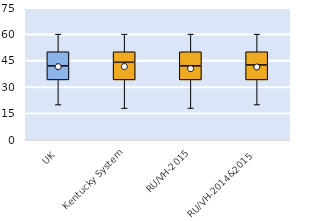
| Category | 25th | 50th | 75th |
|---|---|---|---|
| UK | 34 | 8 | 8 |
| Kentucky System | 34 | 10 | 6 |
| RU/VH-2015 | 34 | 8 | 8 |
| RU/VH-2014&2015 | 34 | 8.5 | 7.5 |